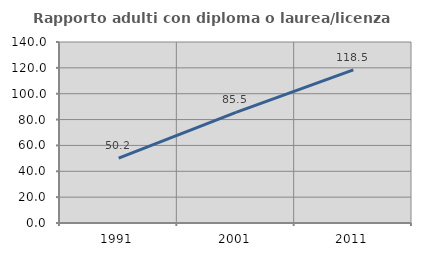
| Category | Rapporto adulti con diploma o laurea/licenza media  |
|---|---|
| 1991.0 | 50.218 |
| 2001.0 | 85.507 |
| 2011.0 | 118.499 |